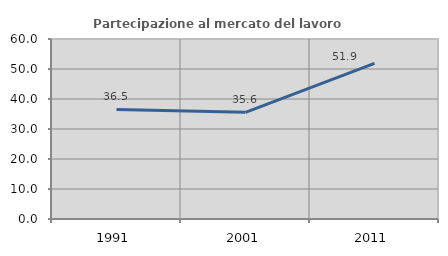
| Category | Partecipazione al mercato del lavoro  femminile |
|---|---|
| 1991.0 | 36.508 |
| 2001.0 | 35.556 |
| 2011.0 | 51.852 |